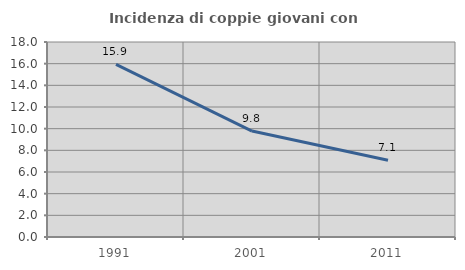
| Category | Incidenza di coppie giovani con figli |
|---|---|
| 1991.0 | 15.932 |
| 2001.0 | 9.781 |
| 2011.0 | 7.091 |